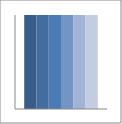
| Category | Series 1 | Series 2 | Series 3 | Series 4 | Series 5 | Series 6 |
|---|---|---|---|---|---|---|
| Point 1 | 1 | 1 | 1 | 1 | 1 | 1 |